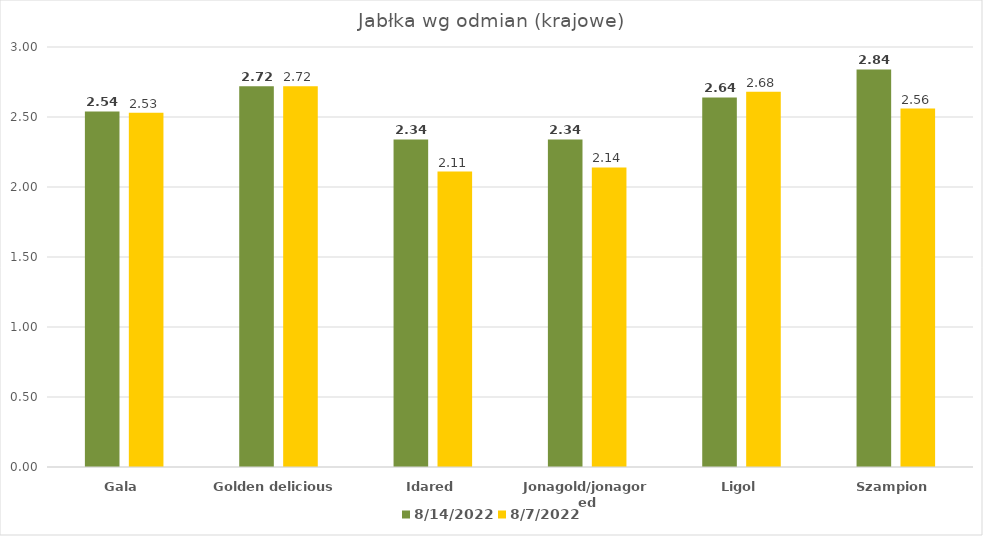
| Category | 2022-08-14 | 2022-08-07 |
|---|---|---|
| Gala | 2.54 | 2.53 |
| Golden delicious | 2.72 | 2.72 |
| Idared | 2.34 | 2.11 |
| Jonagold/jonagored | 2.34 | 2.14 |
| Ligol | 2.64 | 2.68 |
| Szampion | 2.84 | 2.56 |